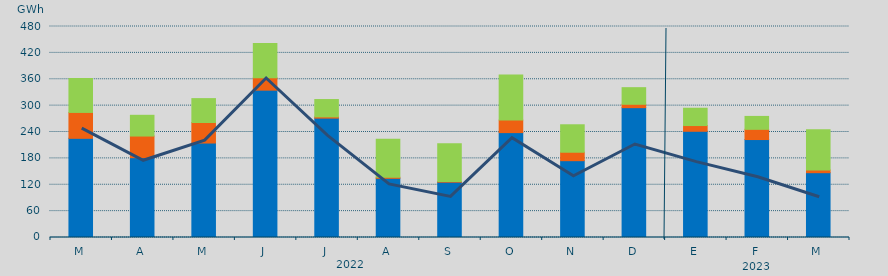
| Category | Asignación SEPE | Asignación Francia | Asignación Portugal |
|---|---|---|---|
| M | 225622.7 | 58889.7 | 77145.2 |
| A | 181585.4 | 49218 | 47192.7 |
| M | 214905.3 | 46679.2 | 54371.7 |
| J | 335176.8 | 28179 | 77960.7 |
| J | 271567.05 | 2839.1 | 39441.4 |
| A | 134609.35 | 2385 | 86328.9 |
| S | 125828.7 | 1385 | 85885 |
| O | 238619.175 | 28420.1 | 102571.3 |
| N | 174742.7 | 19231.9 | 62469.6 |
| D | 295334.825 | 7715.1 | 37807.2 |
| E | 241649.025 | 13030.5 | 39359.9 |
| F | 222841.2 | 23234.4 | 29375.8 |
| M | 147441.275 | 6126.3 | 91808.3 |